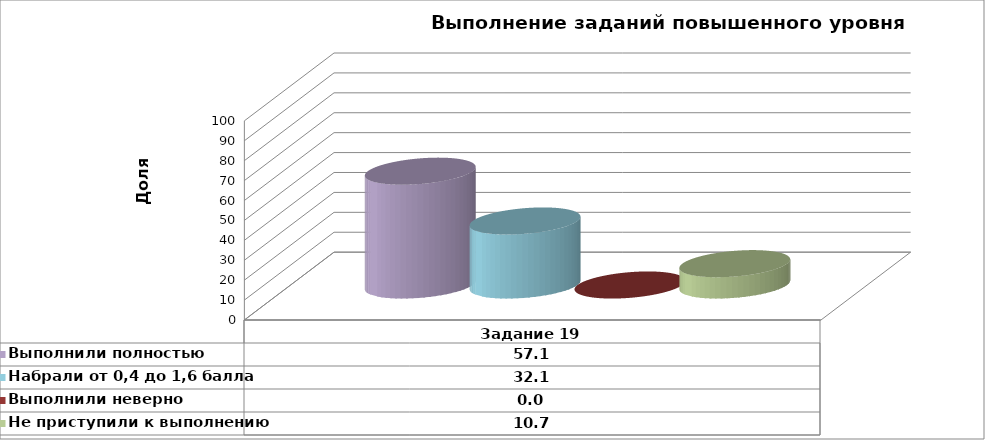
| Category | Series 1 | Выполнили полностью | Series 3 | Набрали от 0,4 до 1,6 балла | Series 5 | Выполнили неверно | Series 7 | Не приступили к выполнению |
|---|---|---|---|---|---|---|---|---|
| Задание 19 |  | 57.143 |  | 32.143 |  | 0 |  | 10.714 |